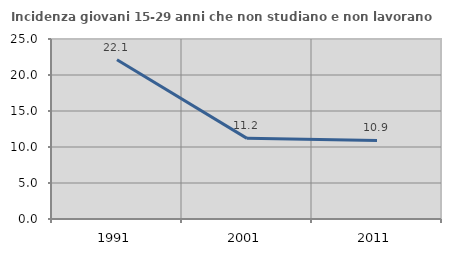
| Category | Incidenza giovani 15-29 anni che non studiano e non lavorano  |
|---|---|
| 1991.0 | 22.124 |
| 2001.0 | 11.2 |
| 2011.0 | 10.909 |